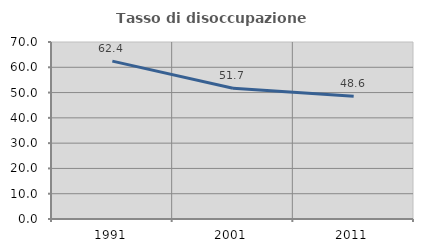
| Category | Tasso di disoccupazione giovanile  |
|---|---|
| 1991.0 | 62.446 |
| 2001.0 | 51.705 |
| 2011.0 | 48.588 |